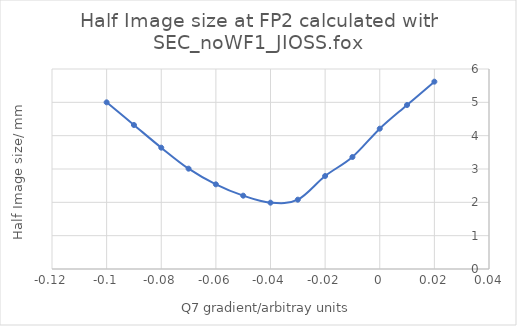
| Category | Series 0 |
|---|---|
| -0.1 | 5 |
| -0.09 | 4.32 |
| -0.08 | 3.64 |
| -0.07 | 3.01 |
| -0.06 | 2.54 |
| -0.05 | 2.2 |
| -0.04 | 1.99 |
| -0.03 | 2.08 |
| -0.019999999999999997 | 2.79 |
| -0.009999999999999997 | 3.36 |
| 0.0 | 4.21 |
| 0.01 | 4.92 |
| 0.02 | 5.62 |